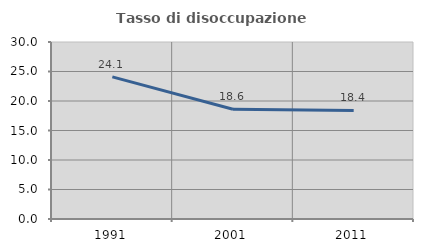
| Category | Tasso di disoccupazione giovanile  |
|---|---|
| 1991.0 | 24.084 |
| 2001.0 | 18.605 |
| 2011.0 | 18.391 |